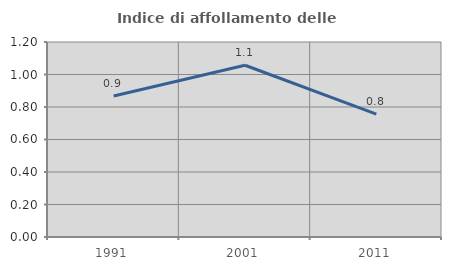
| Category | Indice di affollamento delle abitazioni  |
|---|---|
| 1991.0 | 0.868 |
| 2001.0 | 1.057 |
| 2011.0 | 0.756 |